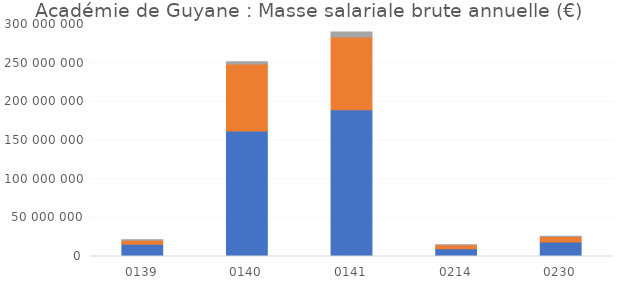
| Category | Rémunération brute | Cotisation et contribution (yc CAS pension) | Prestation sociale |
|---|---|---|---|
| 0139 | 15855797.22 | 5121795.4 | 656350.79 |
| 0140 | 162346905.47 | 86560862.4 | 3060587.25 |
| 0141 | 189824076.18 | 93971638.83 | 6469863.32 |
| 0214 | 10031101.46 | 4681802.01 | 241253.05 |
| 0230 | 18623714.98 | 7297024.18 | 401643.61 |